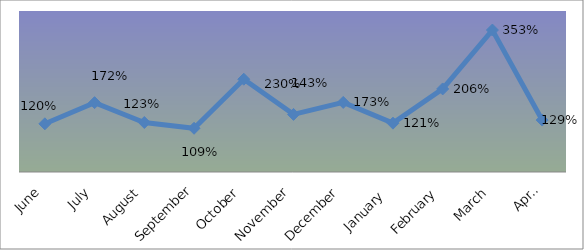
| Category | PERCENTAGE |
|---|---|
| June | 1.197 |
| July | 1.723 |
| August | 1.229 |
| September | 1.086 |
| October | 2.305 |
| November | 1.431 |
| December | 1.729 |
| January  | 1.213 |
| February | 2.064 |
| March | 3.527 |
| April | 1.29 |